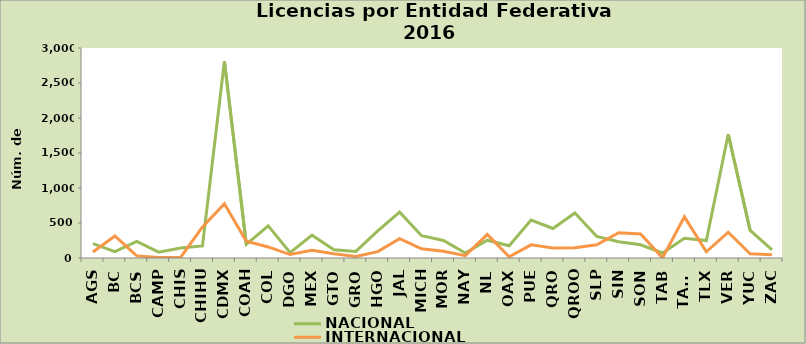
| Category | NACIONAL | INTERNACIONAL |
|---|---|---|
| AGS | 205 | 85 |
| BC | 92 | 315 |
| BCS | 237 | 30 |
| CAMP | 84 | 7 |
| CHIS | 144 | 8 |
| CHIHU | 172 | 443 |
| CDMX | 2810 | 774 |
| COAH | 196 | 240 |
| COL | 459 | 158 |
| DGO | 75 | 49 |
| MEX | 326 | 109 |
| GTO | 119 | 62 |
| GRO | 94 | 23 |
| HGO | 386 | 91 |
| JAL | 655 | 276 |
| MICH | 319 | 131 |
| MOR | 250 | 97 |
| NAY | 72 | 33 |
| NL | 254 | 338 |
| OAX | 175 | 18 |
| PUE | 542 | 188 |
| QRO | 422 | 142 |
| QROO | 643 | 147 |
| SLP | 308 | 190 |
| SIN | 232 | 362 |
| SON | 189 | 343 |
| TAB | 72 | 2 |
| TAMS | 281 | 588 |
| TLX | 249 | 89 |
| VER | 1768 | 368 |
| YUC | 395 | 60 |
| ZAC | 116 | 48 |